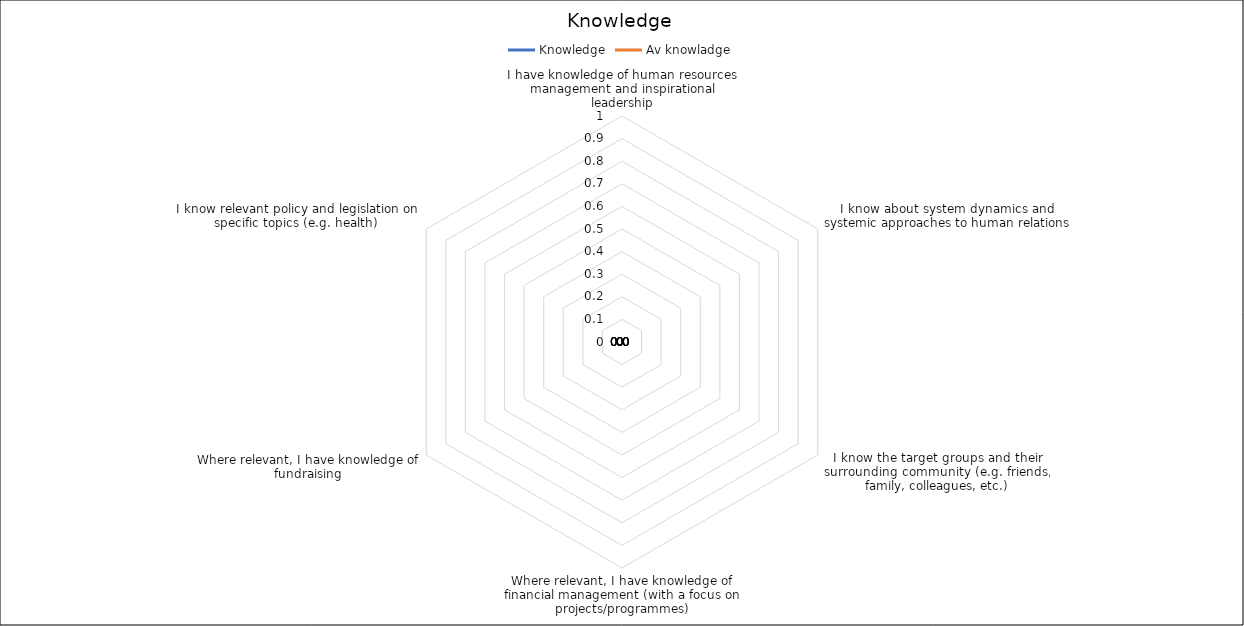
| Category | Knowledge | Av knowladge |
|---|---|---|
| I have knowledge of human resources management and inspirational leadership | 0 | 0 |
| I know about system dynamics and systemic approaches to human relations | 0 | 0 |
| I know the target groups and their surrounding community (e.g. friends, family, colleagues, etc.) | 0 | 0 |
| Where relevant, I have knowledge of financial management (with a focus on projects/programmes) | 0 | 0 |
| Where relevant, I have knowledge of fundraising | 0 | 0 |
| I know relevant policy and legislation on specific topics (e.g. health)  | 0 | 0 |